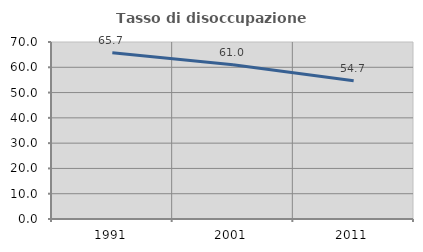
| Category | Tasso di disoccupazione giovanile  |
|---|---|
| 1991.0 | 65.714 |
| 2001.0 | 61.039 |
| 2011.0 | 54.717 |